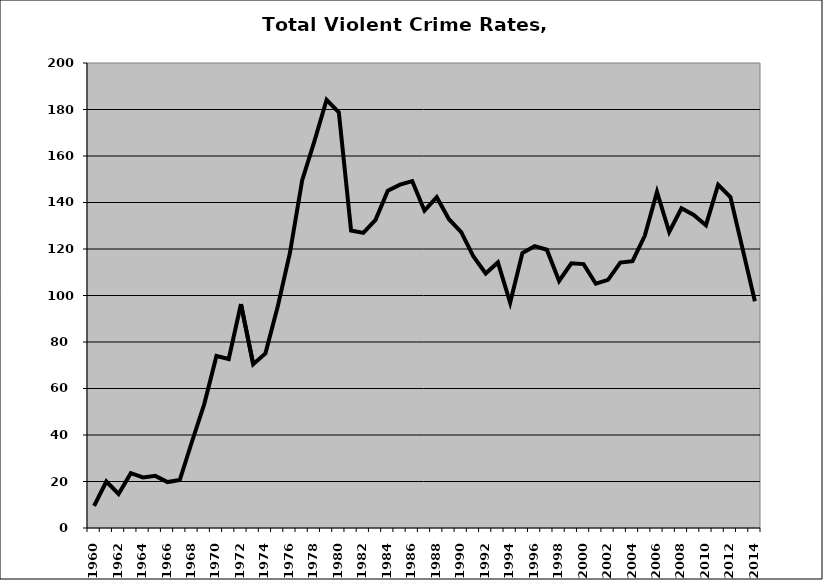
| Category | VCR |
|---|---|
| 1960.0 | 9.49 |
| 1961.0 | 20 |
| 1962.0 | 14.615 |
| 1963.0 | 23.59 |
| 1964.0 | 21.76 |
| 1965.0 | 22.418 |
| 1966.0 | 19.753 |
| 1967.0 | 20.624 |
| 1968.0 | 37.204 |
| 1969.0 | 53.303 |
| 1970.0 | 73.977 |
| 1971.0 | 72.707 |
| 1972.0 | 96.32 |
| 1973.0 | 70.474 |
| 1974.0 | 75.106 |
| 1975.0 | 95.117 |
| 1976.0 | 118.277 |
| 1977.0 | 149.482 |
| 1978.0 | 166.324 |
| 1979.0 | 184.178 |
| 1980.0 | 178.76 |
| 1981.0 | 127.961 |
| 1982.0 | 126.938 |
| 1983.0 | 132.571 |
| 1984.0 | 145.094 |
| 1985.0 | 147.664 |
| 1986.0 | 149.168 |
| 1987.0 | 136.496 |
| 1988.0 | 142.266 |
| 1989.0 | 132.804 |
| 1990.0 | 127.231 |
| 1991.0 | 116.755 |
| 1992.0 | 109.474 |
| 1993.0 | 114.236 |
| 1994.0 | 96.897 |
| 1995.0 | 118.291 |
| 1996.0 | 121.222 |
| 1997.0 | 119.694 |
| 1998.0 | 106.261 |
| 1999.0 | 113.855 |
| 2000.0 | 113.497 |
| 2001.0 | 105.061 |
| 2002.0 | 106.747 |
| 2003.0 | 114.153 |
| 2004.0 | 114.772 |
| 2005.0 | 125.645 |
| 2006.0 | 144.573 |
| 2007.0 | 127.323 |
| 2008.0 | 137.509 |
| 2009.0 | 134.618 |
| 2010.0 | 130.246 |
| 2011.0 | 147.624 |
| 2012.0 | 142.343 |
| 2013.0 | 119.964 |
| 2014.0 | 97.516 |